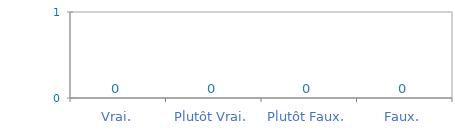
| Category | Véracité Critères |
|---|---|
| Vrai. | 0 |
| Plutôt Vrai. | 0 |
| Plutôt Faux. | 0 |
| Faux. | 0 |